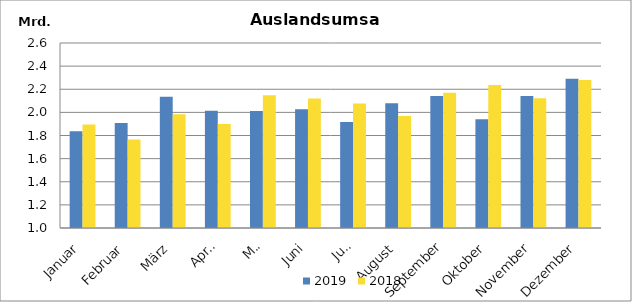
| Category | 2019 | 2018 |
|---|---|---|
| Januar | 1836799.116 | 1894623.463 |
| Februar | 1909013.566 | 1764670.007 |
| März | 2135587.179 | 1984261.809 |
| April | 2013661.98 | 1899508.249 |
| Mai | 2012410.425 | 2148040.18 |
| Juni | 2026799.873 | 2119645.571 |
| Juli | 1917643.156 | 2077246.117 |
| August | 2079459.434 | 1968785.311 |
| September | 2141879.298 | 2169476.317 |
| Oktober | 1940564.03 | 2235945.367 |
| November | 2141665.946 | 2123180.913 |
| Dezember | 2289887.952 | 2279493.616 |